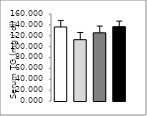
| Category | Series 0 |
|---|---|
| 0 | 136.131 |
| 1 | 112.738 |
| 2 | 125.357 |
| 3 | 136.667 |